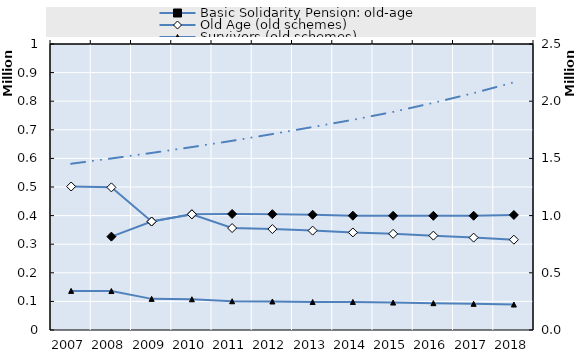
| Category | Basic Solidarity Pension: old-age | Old Age (old schemes) | Survivors' pension from occupational accident insurance | 0 | Series 14 | Series 15 | Series 16 | Series 17 | Series 18 | Series 19 |
|---|---|---|---|---|---|---|---|---|---|---|
| 2007.0 | 0 | 501720.417 |  |  |  |  |  |  |  |  |
| 2008.0 | 326482.5 | 498754.25 |  |  |  |  |  |  |  |  |
| 2009.0 | 379293.833 | 379293.833 |  |  |  |  |  |  |  |  |
| 2010.0 | 404539.25 | 404539.25 |  |  |  |  |  |  |  |  |
| 2011.0 | 405651.833 | 356431.942 |  |  |  |  |  |  |  |  |
| 2012.0 | 404916.083 | 352960.575 |  |  |  |  |  |  |  |  |
| 2013.0 | 403031.667 | 347472.583 |  |  |  |  |  |  |  |  |
| 2014.0 | 399666.583 | 341102.167 |  |  |  |  |  |  |  |  |
| 2015.0 | 399232.583 | 336253 |  |  |  |  |  |  |  |  |
| 2016.0 | 399216.417 | 329930.917 |  |  |  |  |  |  |  |  |
| 2017.0 | 399448.833 | 323033 |  |  |  |  |  |  |  |  |
| 2018.0 | 402249.25 | 315767.833 |  |  |  |  |  |  |  |  |